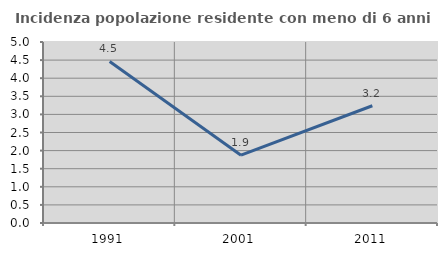
| Category | Incidenza popolazione residente con meno di 6 anni |
|---|---|
| 1991.0 | 4.462 |
| 2001.0 | 1.874 |
| 2011.0 | 3.239 |